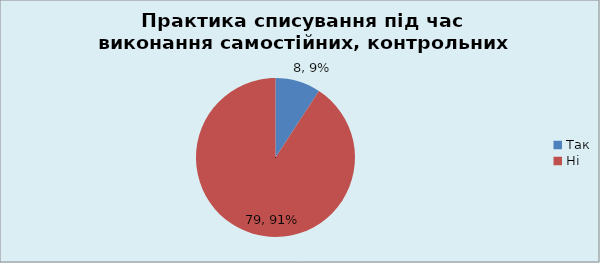
| Category | Кількість |
|---|---|
| Так | 8 |
| Ні | 79 |